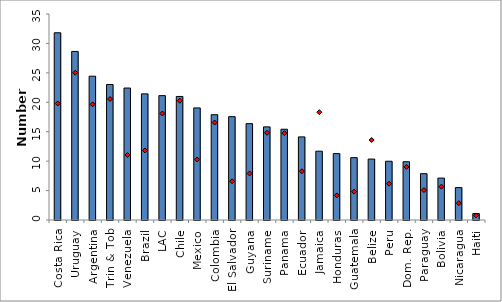
| Category | 2008 |
|---|---|
| Costa Rica | 31.81 |
| Uruguay | 28.64 |
| Argentina | 24.43 |
| Trin & Tob | 23.02 |
| Venezuela | 22.42 |
| Brazil | 21.43 |
| LAC | 21.13 |
| Chile | 20.99 |
| Mexico | 19.04 |
| Colombia | 17.89 |
| El Salvador | 17.56 |
| Guyana | 16.37 |
| Suriname | 15.82 |
| Panama | 15.42 |
| Ecuador | 14.12 |
| Jamaica | 11.69 |
| Honduras | 11.28 |
| Guatemala | 10.59 |
| Belize | 10.35 |
| Peru | 9.98 |
| Dom. Rep. | 9.9 |
| Paraguay | 7.87 |
| Bolivia | 7.12 |
| Nicaragua | 5.51 |
| Haiti | 1.09 |